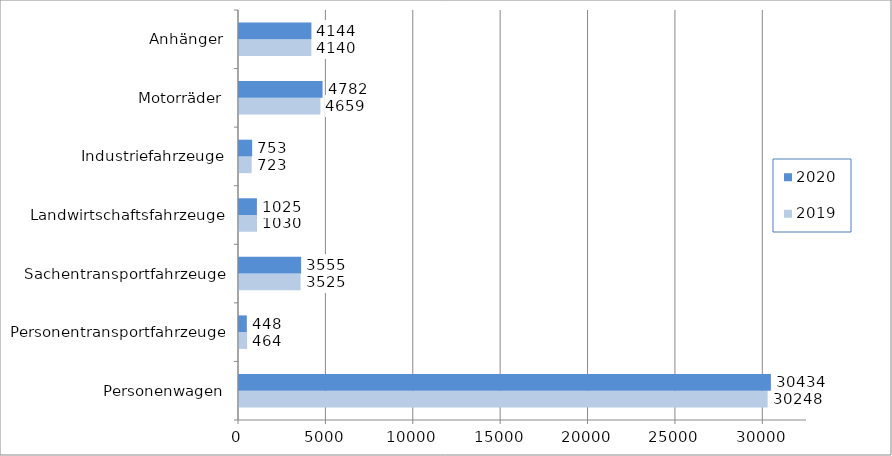
| Category | 2019 | 2020 |
|---|---|---|
| Personenwagen | 30248 | 30434 |
| Personentransportfahrzeuge | 464 | 448 |
| Sachentransportfahrzeuge | 3525 | 3555 |
| Landwirtschaftsfahrzeuge | 1030 | 1025 |
| Industriefahrzeuge | 723 | 753 |
| Motorräder | 4659 | 4782 |
| Anhänger | 4140 | 4144 |